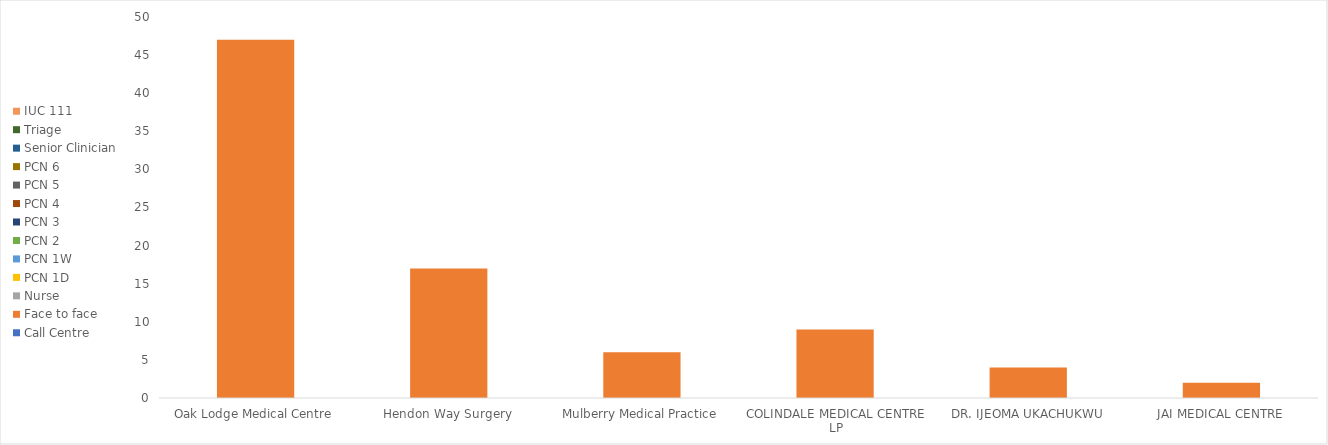
| Category | Call Centre | Face to face | Nurse | PCN 1D | PCN 1W | PCN 2 | PCN 3 | PCN 4 | PCN 5 | PCN 6 | Senior Clinician | Triage | IUC 111   |
|---|---|---|---|---|---|---|---|---|---|---|---|---|---|
| Oak Lodge Medical Centre | 28 | 47 | 1 | 130 | 0 | 0 | 0 | 6 | 3 | 3 | 0 | 18 | 9 |
| Hendon Way Surgery | 12 | 17 | 0 | 13 | 0 | 0 | 0 | 0 | 0 | 0 | 0 | 5 | 14 |
| Mulberry Medical Practice | 6 | 6 | 0 | 32 | 0 | 0 | 3 | 0 | 0 | 0 | 0 | 5 | 3 |
| COLINDALE MEDICAL CENTRE LP | 2 | 9 | 0 | 16 | 0 | 0 | 0 | 0 | 0 | 0 | 0 | 1 | 6 |
| DR. IJEOMA UKACHUKWU | 2 | 4 | 0 | 19 | 0 | 0 | 3 | 0 | 0 | 0 | 0 | 1 | 1 |
| JAI MEDICAL CENTRE | 1 | 2 | 0 | 0 | 0 | 0 | 0 | 0 | 0 | 0 | 0 | 1 | 1 |